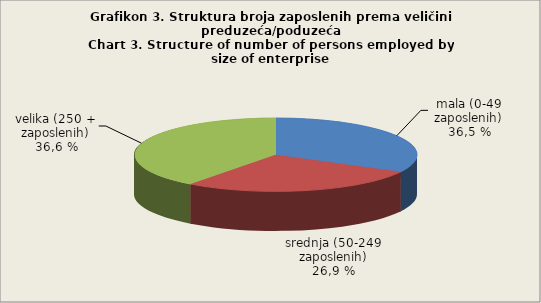
| Category | Broj zaposlenih osoba
Number of persons employed
  |
|---|---|
| mala (0-49 zaposlenih) | 32.8 |
| srednja (50-249 zaposlenih) | 27.5 |
| velika (250 + zaposlenih) | 39.8 |